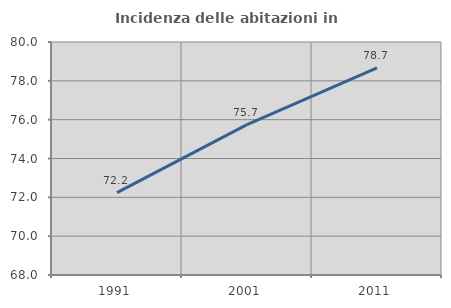
| Category | Incidenza delle abitazioni in proprietà  |
|---|---|
| 1991.0 | 72.244 |
| 2001.0 | 75.746 |
| 2011.0 | 78.671 |